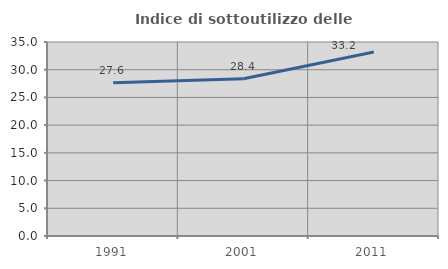
| Category | Indice di sottoutilizzo delle abitazioni  |
|---|---|
| 1991.0 | 27.646 |
| 2001.0 | 28.371 |
| 2011.0 | 33.185 |